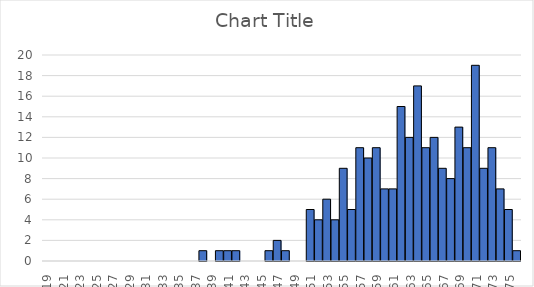
| Category | Series 0 |
|---|---|
| 19.0 | 0 |
| 20.0 | 0 |
| 21.0 | 0 |
| 22.0 | 0 |
| 23.0 | 0 |
| 24.0 | 0 |
| 25.0 | 0 |
| 26.0 | 0 |
| 27.0 | 0 |
| 28.0 | 0 |
| 29.0 | 0 |
| 30.0 | 0 |
| 31.0 | 0 |
| 32.0 | 0 |
| 33.0 | 0 |
| 34.0 | 0 |
| 35.0 | 0 |
| 36.0 | 0 |
| 37.0 | 0 |
| 38.0 | 1 |
| 39.0 | 0 |
| 40.0 | 1 |
| 41.0 | 1 |
| 42.0 | 1 |
| 43.0 | 0 |
| 44.0 | 0 |
| 45.0 | 0 |
| 46.0 | 1 |
| 47.0 | 2 |
| 48.0 | 1 |
| 49.0 | 0 |
| 50.0 | 0 |
| 51.0 | 5 |
| 52.0 | 4 |
| 53.0 | 6 |
| 54.0 | 4 |
| 55.0 | 9 |
| 56.0 | 5 |
| 57.0 | 11 |
| 58.0 | 10 |
| 59.0 | 11 |
| 60.0 | 7 |
| 61.0 | 7 |
| 62.0 | 15 |
| 63.0 | 12 |
| 64.0 | 17 |
| 65.0 | 11 |
| 66.0 | 12 |
| 67.0 | 9 |
| 68.0 | 8 |
| 69.0 | 13 |
| 70.0 | 11 |
| 71.0 | 19 |
| 72.0 | 9 |
| 73.0 | 11 |
| 74.0 | 7 |
| 75.0 | 5 |
| 76.0 | 1 |